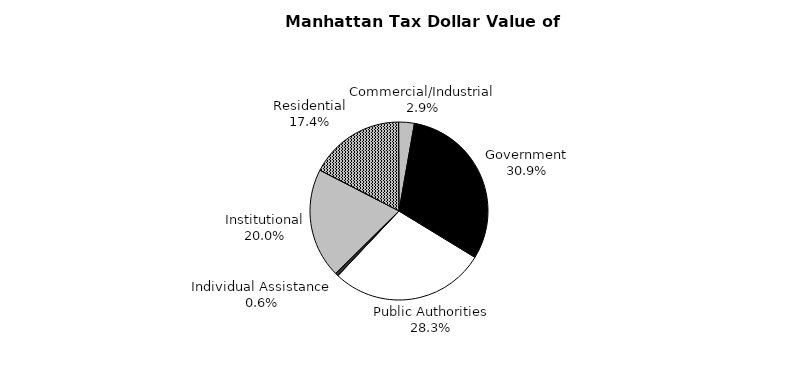
| Category | Series 0 |
|---|---|
| Government | 2196139215 |
| Public Authorities | 2009976894 |
| Individual Assistance | 39877553 |
| Institutional | 1417696479 |
| Residential | 1231476902 |
| Commercial/Industrial | 202285583 |